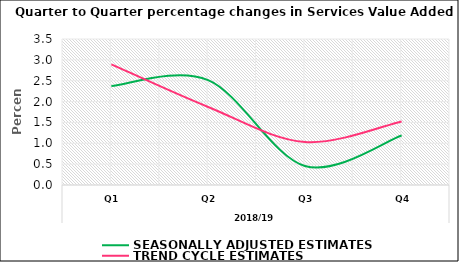
| Category | SEASONALLY ADJUSTED ESTIMATES | TREND CYCLE ESTIMATES |
|---|---|---|
| 0 | 2.376 | 2.893 |
| 1 | 2.516 | 1.871 |
| 2 | 0.456 | 1.031 |
| 3 | 1.186 | 1.524 |